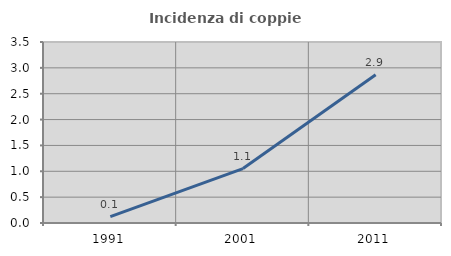
| Category | Incidenza di coppie miste |
|---|---|
| 1991.0 | 0.124 |
| 2001.0 | 1.053 |
| 2011.0 | 2.866 |